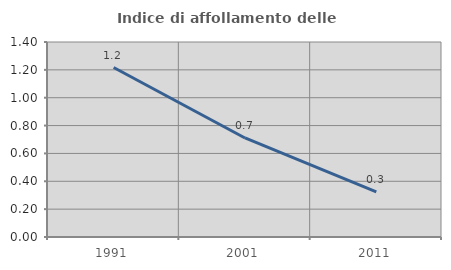
| Category | Indice di affollamento delle abitazioni  |
|---|---|
| 1991.0 | 1.217 |
| 2001.0 | 0.711 |
| 2011.0 | 0.325 |